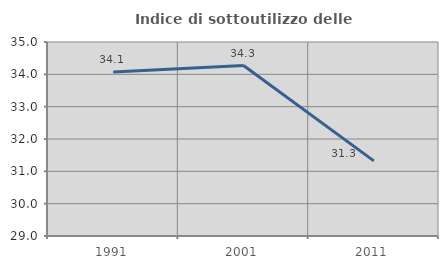
| Category | Indice di sottoutilizzo delle abitazioni  |
|---|---|
| 1991.0 | 34.075 |
| 2001.0 | 34.272 |
| 2011.0 | 31.323 |